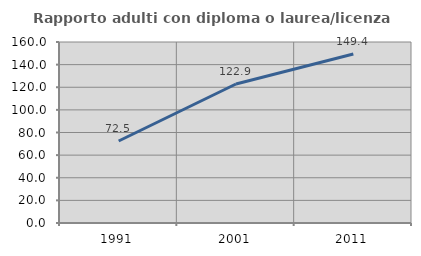
| Category | Rapporto adulti con diploma o laurea/licenza media  |
|---|---|
| 1991.0 | 72.488 |
| 2001.0 | 122.876 |
| 2011.0 | 149.378 |